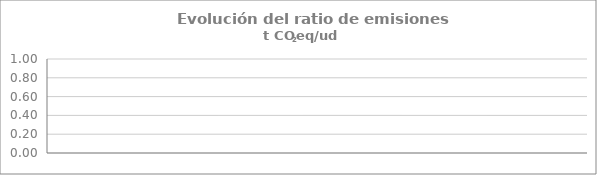
| Category | Series 1 |
|---|---|
|  | 0 |
|  | 0 |
|  | 0 |
|  | 0 |